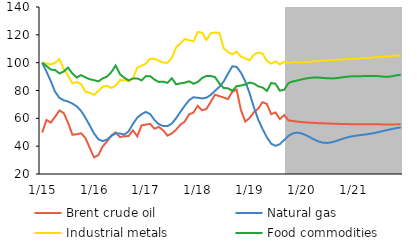
| Category | Brent crude oil | Natural gas | Industrial metals | Food commodities |
|---|---|---|---|---|
|  1/15 | 49.758 | 100 | 100 | 100 |
| 2 | 58.795 | 93.587 | 99.447 | 97.61 |
| 3 | 56.939 | 86.683 | 98.694 | 95.043 |
| 4 | 61.136 | 79.043 | 99.91 | 94.708 |
| 5 | 65.609 | 74.666 | 102.513 | 92.252 |
| 6 | 63.753 | 72.949 | 95.306 | 93.666 |
| 7 | 56.764 | 72.072 | 90.716 | 96.445 |
| 8 | 48.206 | 70.601 | 85.084 | 92.155 |
| 9 | 48.54 | 68.591 | 86.115 | 89.356 |
| 10 | 49.293 | 65.314 | 84.587 | 91.06 |
| 11 | 45.932 | 60.5 | 79.258 | 89.434 |
| 12 | 38.904 | 54.867 | 78.434 | 88.105 |
|  1/16 | 31.926 | 49.108 | 76.848 | 87.452 |
| 2 | 33.527 | 45.013 | 79.703 | 86.547 |
| 3 | 39.79 | 43.643 | 82.693 | 88.65 |
| 4 | 43.34 | 44.699 | 83.376 | 89.984 |
| 5 | 47.647 | 47.228 | 81.811 | 93.168 |
| 6 | 49.927 | 49.233 | 83.481 | 97.947 |
| 7 | 46.535 | 49.096 | 87.466 | 91.753 |
| 8 | 47.159 | 48.301 | 87.425 | 89.188 |
| 9 | 47.24 | 50.589 | 86.545 | 87.268 |
| 10 | 51.388 | 55.926 | 88.712 | 88.629 |
| 11 | 47.079 | 60.421 | 96.355 | 88.705 |
| 12 | 54.916 | 62.973 | 97.676 | 87.26 |
|  1/17 | 55.51 | 64.621 | 99.349 | 90.348 |
| 2 | 55.997 | 63.025 | 102.876 | 90.261 |
| 3 | 52.539 | 58.736 | 102.739 | 87.811 |
| 4 | 53.819 | 55.798 | 101.399 | 86.112 |
| 5 | 51.39 | 54.498 | 100.169 | 86.362 |
| 6 | 47.554 | 54.411 | 99.885 | 85.51 |
| 7 | 49.149 | 56.249 | 103.485 | 88.802 |
| 8 | 51.87 | 60.081 | 110.967 | 84.404 |
| 9 | 55.515 | 64.703 | 113.902 | 85.12 |
| 10 | 57.649 | 69.083 | 116.948 | 85.594 |
| 11 | 62.866 | 73.02 | 116.113 | 86.634 |
| 12 | 64.092 | 75.179 | 115.333 | 84.884 |
|  1/18 | 69.079 | 74.765 | 121.995 | 86.058 |
| 2 | 65.73 | 74.31 | 121.52 | 88.987 |
| 3 | 66.72 | 74.807 | 116.383 | 90.396 |
| 4 | 71.762 | 76.83 | 121.053 | 90.402 |
| 5 | 77.007 | 79.814 | 121.699 | 89.631 |
| 6 | 75.941 | 82.558 | 121.455 | 85.084 |
| 7 | 74.952 | 86.406 | 110.296 | 81.836 |
| 8 | 73.842 | 92.054 | 107.709 | 81.576 |
| 9 | 79.11 | 97.36 | 106.075 | 79.731 |
| 10 | 80.63 | 96.966 | 107.898 | 83.137 |
| 11 | 65.949 | 92.832 | 104.332 | 83.564 |
| 12 | 57.674 | 86.598 | 103 | 84.318 |
|  1/19 | 60.241 | 78.003 | 101.636 | 85.695 |
| 2 | 64.432 | 67.93 | 105.768 | 85.01 |
| 3 | 67.028 | 59.087 | 107.286 | 83.005 |
| 4 | 71.629 | 52.329 | 106.481 | 82.161 |
| 5 | 70.303 | 46.382 | 101.269 | 79.693 |
| 6 | 63.038 | 41.74 | 99.317 | 85.393 |
| 7 | 64.215 | 40.234 | 100.899 | 84.823 |
| 8 | 59.502 | 41.429 | 98.74 | 79.868 |
| 9 | 62.287 | 44.457 | 100.796 | 80.494 |
| 10 | 58.503 | 47.369 | 99.895 | 85.391 |
| 11 | 58.102 | 49.187 | 100.215 | 86.462 |
| 12 | 57.631 | 49.743 | 100.253 | 87.187 |
|  1/20 | 57.305 | 49.221 | 100.173 | 87.946 |
| 2 | 57.074 | 47.958 | 100.412 | 88.608 |
| 3 | 56.877 | 46.358 | 100.687 | 89.106 |
| 4 | 56.696 | 44.713 | 100.926 | 89.355 |
| 5 | 56.532 | 43.305 | 101.196 | 89.281 |
| 6 | 56.41 | 42.489 | 101.413 | 89.026 |
| 7 | 56.292 | 42.326 | 101.623 | 88.797 |
| 8 | 56.17 | 42.812 | 101.858 | 88.67 |
| 9 | 56.06 | 43.684 | 102.056 | 88.829 |
| 10 | 55.946 | 44.733 | 102.259 | 89.247 |
| 11 | 55.883 | 45.755 | 102.439 | 89.714 |
| 12 | 55.831 | 46.608 | 102.602 | 90.065 |
|  1/21 | 55.793 | 47.245 | 102.733 | 90.231 |
| 2 | 55.765 | 47.706 | 102.92 | 90.294 |
| 3 | 55.739 | 48.085 | 103.118 | 90.322 |
| 4 | 55.712 | 48.482 | 103.329 | 90.369 |
| 5 | 55.69 | 48.963 | 103.557 | 90.378 |
| 6 | 55.673 | 49.552 | 103.96 | 90.37 |
| 7 | 55.659 | 50.231 | 104.18 | 90.309 |
| 8 | 55.651 | 50.962 | 104.357 | 89.924 |
| 9 | 55.644 | 51.694 | 104.539 | 89.806 |
| 10 | 55.64 | 52.381 | 104.749 | 90.272 |
| 11 | 55.661 | 52.991 | 105.005 | 90.894 |
| 12 | 55.688 | 53.517 | 105.276 | 91.301 |